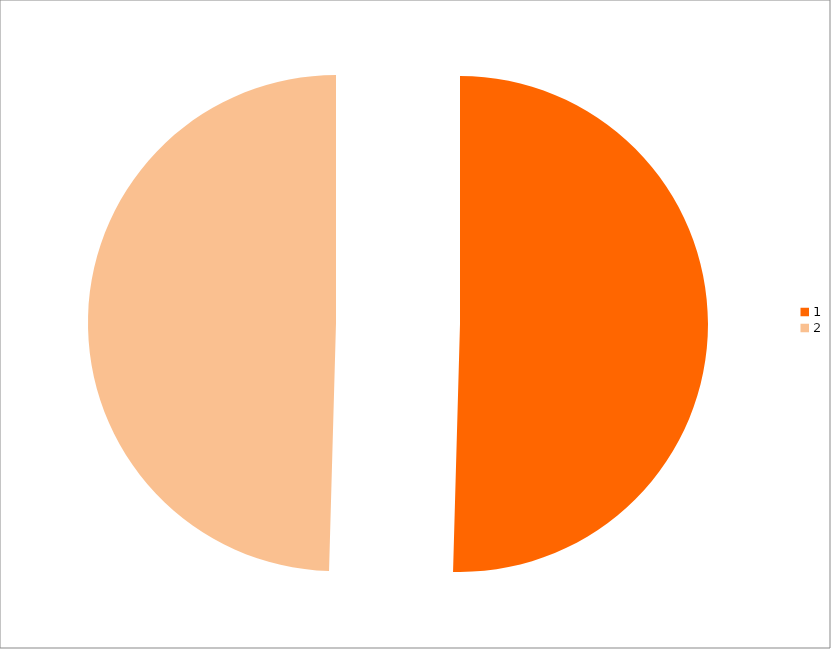
| Category | Series 0 |
|---|---|
| 0 | 113 |
| 1 | 111 |